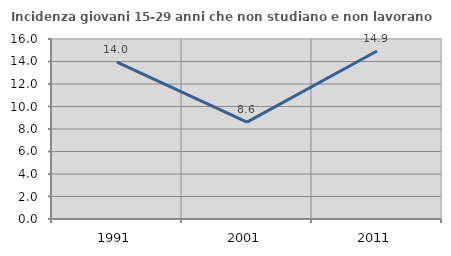
| Category | Incidenza giovani 15-29 anni che non studiano e non lavorano  |
|---|---|
| 1991.0 | 13.95 |
| 2001.0 | 8.617 |
| 2011.0 | 14.935 |